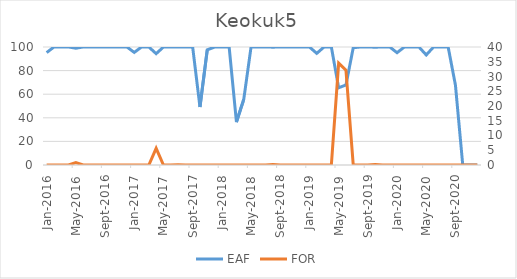
| Category | EAF |
|---|---|
| 2016-01-01 | 95.27 |
| 2016-02-01 | 100 |
| 2016-03-01 | 100 |
| 2016-04-01 | 100 |
| 2016-05-01 | 98.98 |
| 2016-06-01 | 100 |
| 2016-07-01 | 100 |
| 2016-08-01 | 100 |
| 2016-09-01 | 100 |
| 2016-10-01 | 100 |
| 2016-11-01 | 100 |
| 2016-12-01 | 100 |
| 2017-01-01 | 95.42 |
| 2017-02-01 | 100 |
| 2017-03-01 | 100 |
| 2017-04-01 | 94.35 |
| 2017-05-01 | 100 |
| 2017-06-01 | 100 |
| 2017-07-01 | 99.9 |
| 2017-08-01 | 100 |
| 2017-09-01 | 100 |
| 2017-10-01 | 49.15 |
| 2017-11-01 | 97.59 |
| 2017-12-01 | 100 |
| 2018-01-01 | 100 |
| 2018-02-01 | 100 |
| 2018-03-01 | 36.36 |
| 2018-04-01 | 55.56 |
| 2018-05-01 | 100 |
| 2018-06-01 | 100 |
| 2018-07-01 | 100 |
| 2018-08-01 | 99.86 |
| 2018-09-01 | 100 |
| 2018-10-01 | 100 |
| 2018-11-01 | 100 |
| 2018-12-01 | 100 |
| 2019-01-01 | 100 |
| 2019-02-01 | 94.6 |
| 2019-03-01 | 100 |
| 2019-04-01 | 100 |
| 2019-05-01 | 65.44 |
| 2019-06-01 | 67.83 |
| 2019-07-01 | 99.39 |
| 2019-08-01 | 100 |
| 2019-09-01 | 100 |
| 2019-10-01 | 99.83 |
| 2019-11-01 | 100 |
| 2019-12-01 | 100 |
| 2020-01-01 | 95.17 |
| 2020-02-01 | 100 |
| 2020-03-01 | 100 |
| 2020-04-01 | 100 |
| 2020-05-01 | 93.25 |
| 2020-06-01 | 100 |
| 2020-07-01 | 100 |
| 2020-08-01 | 100 |
| 2020-09-01 | 67.64 |
| 2020-10-01 | 0 |
| 2020-11-01 | 0 |
| 2020-12-01 | 0 |